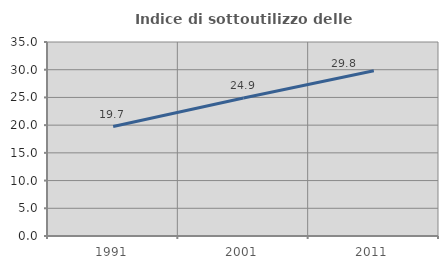
| Category | Indice di sottoutilizzo delle abitazioni  |
|---|---|
| 1991.0 | 19.746 |
| 2001.0 | 24.897 |
| 2011.0 | 29.811 |